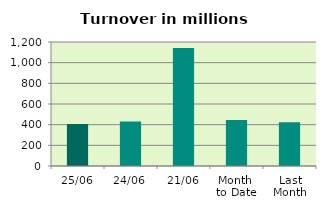
| Category | Series 0 |
|---|---|
| 25/06 | 406.93 |
| 24/06 | 431.632 |
| 21/06 | 1141.214 |
| Month 
to Date | 444.679 |
| Last
Month | 424.091 |